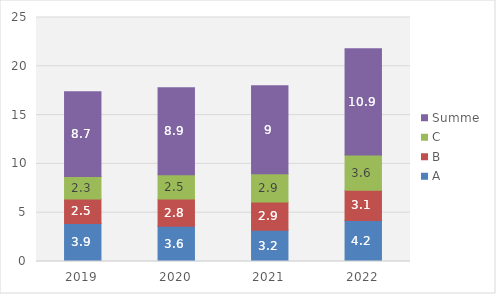
| Category | A | B | C | Summe |
|---|---|---|---|---|
| 2019.0 | 3.9 | 2.5 | 2.3 | 8.7 |
| 2020.0 | 3.6 | 2.8 | 2.5 | 8.9 |
| 2021.0 | 3.2 | 2.9 | 2.9 | 9 |
| 2022.0 | 4.2 | 3.1 | 3.6 | 10.9 |